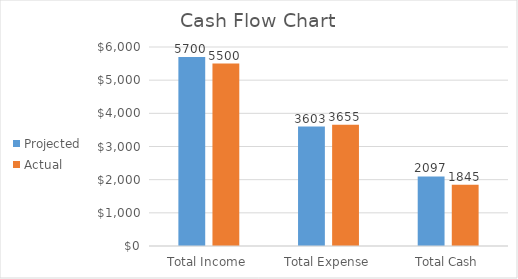
| Category | Projected | Actual |
|---|---|---|
| Total Income | 5700 | 5500 |
| Total Expense | 3603 | 3655 |
| Total Cash | 2097 | 1845 |